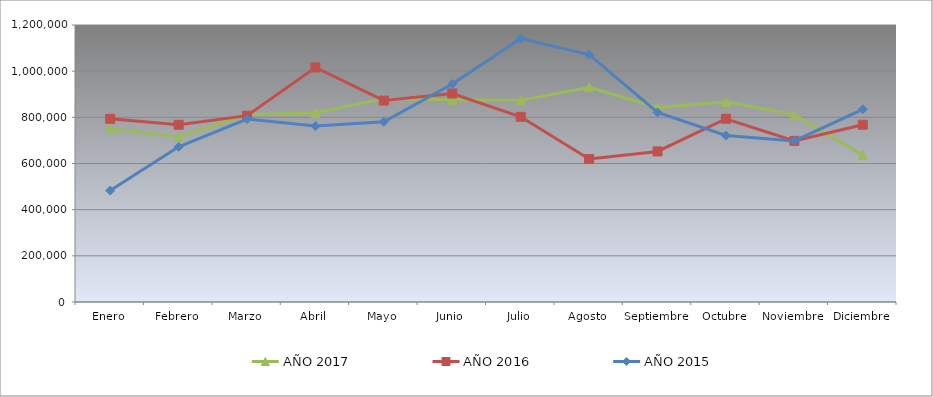
| Category | AÑO 2017 | AÑO 2016 | AÑO 2015 |
|---|---|---|---|
| Enero | 751642.544 | 793560 | 482640 |
| Febrero | 715013.748 | 767760 | 672350 |
| Marzo | 810696.367 | 807290 | 792610 |
| Abril | 818914.057 | 1016250 | 762160 |
| Mayo | 881032.405 | 872640 | 780440 |
| Junio | 875992.93 | 903340 | 944270 |
| Julio | 873512.971 | 802260 | 1141510 |
| Agosto | 930125.543 | 619560 | 1071680 |
| Septiembre | 841515.305 | 652360 | 820990 |
| Octubre | 867097.726 | 793920 | 721260 |
| Noviembre | 811659.272 | 698160 | 697830 |
| Diciembre | 635799.078 | 767810 | 834900 |